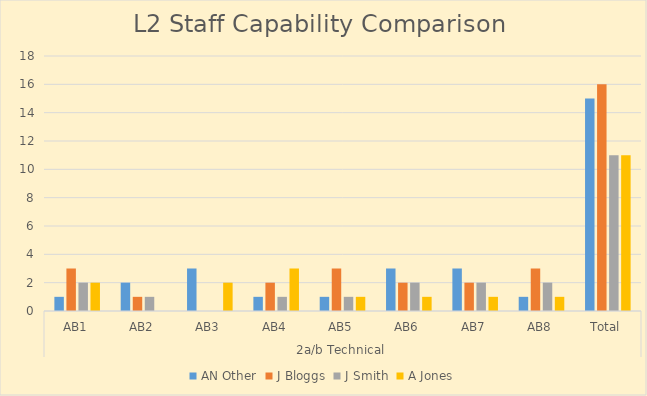
| Category | AN Other | J Bloggs | J Smith | A Jones |
|---|---|---|---|---|
| 0 | 1 | 3 | 2 | 2 |
| 1 | 2 | 1 | 1 | 0 |
| 2 | 3 | 0 | 0 | 2 |
| 3 | 1 | 2 | 1 | 3 |
| 4 | 1 | 3 | 1 | 1 |
| 5 | 3 | 2 | 2 | 1 |
| 6 | 3 | 2 | 2 | 1 |
| 7 | 1 | 3 | 2 | 1 |
| 8 | 15 | 16 | 11 | 11 |